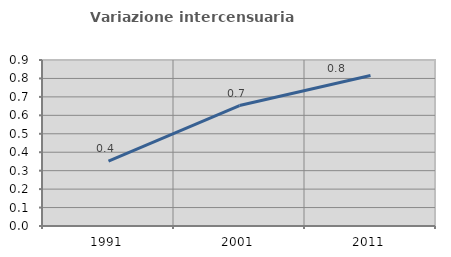
| Category | Variazione intercensuaria annua |
|---|---|
| 1991.0 | 0.352 |
| 2001.0 | 0.653 |
| 2011.0 | 0.816 |